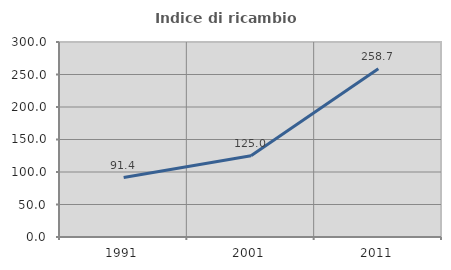
| Category | Indice di ricambio occupazionale  |
|---|---|
| 1991.0 | 91.429 |
| 2001.0 | 125 |
| 2011.0 | 258.73 |